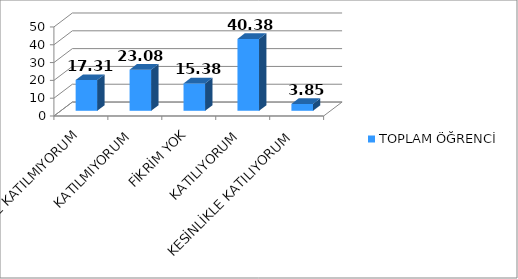
| Category | TOPLAM ÖĞRENCİ |
|---|---|
| KESİNLİKLE KATILMIYORUM | 17.31 |
| KATILMIYORUM | 23.08 |
| FİKRİM YOK | 15.38 |
| KATILIYORUM | 40.38 |
| KESİNLİKLE KATILIYORUM | 3.85 |